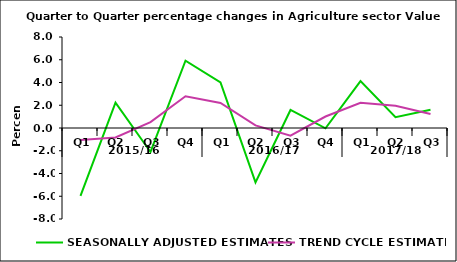
| Category | SEASONALLY ADJUSTED ESTIMATES | TREND CYCLE ESTIMATES |
|---|---|---|
| 0 | -5.963 | -1.062 |
| 1 | 2.223 | -0.838 |
| 2 | -2.107 | 0.518 |
| 3 | 5.916 | 2.789 |
| 4 | 4.003 | 2.207 |
| 5 | -4.783 | 0.232 |
| 6 | 1.584 | -0.68 |
| 7 | -0.025 | 1.01 |
| 8 | 4.12 | 2.219 |
| 9 | 0.957 | 1.964 |
| 10 | 1.607 | 1.229 |